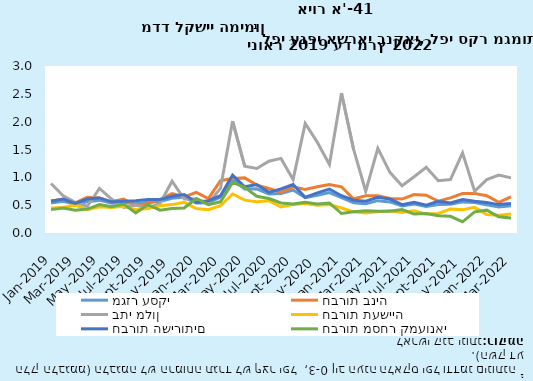
| Category | מגזר עסקי | חברות בניה | בתי מלון | חברות תעשייה | חברות השירותים | חברות מסחר קמעונאי |
|---|---|---|---|---|---|---|
| 2019-01-31 | 0.54 | 0.58 | 0.89 | 0.45 | 0.57 | 0.42 |
| 2019-02-28 | 0.569 | 0.6 | 0.67 | 0.46 | 0.61 | 0.45 |
| 2019-03-31 | 0.519 | 0.54 | 0.55 | 0.5 | 0.53 | 0.41 |
| 2019-04-30 | 0.56 | 0.64 | 0.48 | 0.42 | 0.61 | 0.43 |
| 2019-05-31 | 0.59 | 0.63 | 0.8 | 0.47 | 0.63 | 0.51 |
| 2019-06-30 | 0.534 | 0.56 | 0.61 | 0.46 | 0.56 | 0.47 |
| 2019-07-31 | 0.549 | 0.61 | 0.46 | 0.48 | 0.57 | 0.52 |
| 2019-08-31 | 0.527 | 0.49 | 0.5 | 0.42 | 0.58 | 0.36 |
| 2019-09-30 | 0.553 | 0.53 | 0.45 | 0.44 | 0.6 | 0.51 |
| 2019-10-31 | 0.566 | 0.6 | 0.53 | 0.49 | 0.6 | 0.41 |
| 2019-11-30 | 0.623 | 0.71 | 0.93 | 0.51 | 0.66 | 0.44 |
| 2019-12-31 | 0.645 | 0.65 | 0.61 | 0.55 | 0.69 | 0.45 |
| 2020-01-31 | 0.541 | 0.73 | 0.61 | 0.44 | 0.55 | 0.62 |
| 2020-02-29 | 0.543 | 0.62 | 0.54 | 0.42 | 0.58 | 0.51 |
| 2020-03-31 | 0.644 | 0.94 | 0.8 | 0.49 | 0.67 | 0.56 |
| 2020-04-30 | 0.962 | 0.98 | 2.01 | 0.7 | 1.04 | 0.91 |
| 2020-05-31 | 0.789 | 0.99 | 1.2 | 0.59 | 0.83 | 0.82 |
| 2020-06-30 | 0.793 | 0.86 | 1.16 | 0.56 | 0.87 | 0.66 |
| 2020-07-31 | 0.702 | 0.8 | 1.29 | 0.58 | 0.73 | 0.62 |
| 2020-08-31 | 0.708 | 0.73 | 1.34 | 0.47 | 0.79 | 0.54 |
| 2020-09-30 | 0.771 | 0.83 | 0.96 | 0.51 | 0.87 | 0.52 |
| 2020-10-31 | 0.634 | 0.78 | 1.97 | 0.53 | 0.64 | 0.55 |
| 2020-11-30 | 0.678 | 0.83 | 1.63 | 0.5 | 0.72 | 0.52 |
| 2020-12-31 | 0.726 | 0.87 | 1.23 | 0.51 | 0.79 | 0.54 |
| 2021-01-31 | 0.636 | 0.83 | 2.51 | 0.45 | 0.67 | 0.35 |
| 2021-02-28 | 0.544 | 0.61 | 1.5 | 0.38 | 0.59 | 0.38 |
| 2021-03-31 | 0.524 | 0.67 | 0.75 | 0.36 | 0.57 | 0.4 |
| 2021-04-30 | 0.581 | 0.67 | 1.52 | 0.38 | 0.64 | 0.39 |
| 2021-05-31 | 0.558 | 0.62 | 1.09 | 0.4 | 0.61 | 0.39 |
| 2021-06-30 | 0.485 | 0.61 | 0.85 | 0.37 | 0.51 | 0.42 |
| 2021-07-31 | 0.522 | 0.69 | 1.01 | 0.4 | 0.55 | 0.34 |
| 2021-08-31 | 0.477 | 0.68 | 1.18 | 0.34 | 0.5 | 0.35 |
| 2021-09-30 | 0.513 | 0.57 | 0.94 | 0.35 | 0.57 | 0.31 |
| 2021-10-31 | 0.516 | 0.63 | 0.96 | 0.43 | 0.54 | 0.3 |
| 2021-11-30 | 0.559 | 0.71 | 1.44 | 0.42 | 0.6 | 0.2 |
| 2021-12-31 | 0.549 | 0.71 | 0.75 | 0.46 | 0.57 | 0.38 |
| 2022-01-31 | 0.506 | 0.67 | 0.96 | 0.33 | 0.55 | 0.41 |
| 2022-02-28 | 0.466 | 0.55 | 1.04 | 0.32 | 0.51 | 0.29 |
| 2022-03-31 | 0.489 | 0.65 | 0.99 | 0.34 | 0.53 | 0.27 |